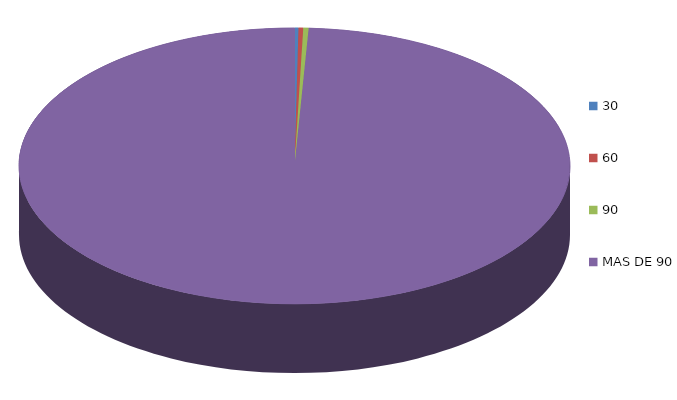
| Category | Series 0 | 98,191.8 |
|---|---|---|
| 0 | 98191.8 |  |
| 1 | 116135.7 |  |
| 2 | 134086.6 |  |
| 3 | 42113598.3 |  |